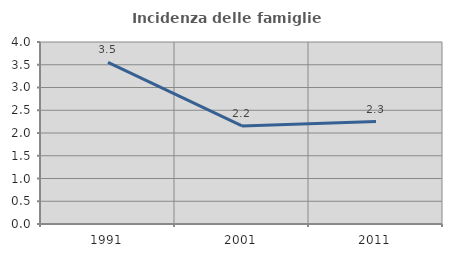
| Category | Incidenza delle famiglie numerose |
|---|---|
| 1991.0 | 3.55 |
| 2001.0 | 2.154 |
| 2011.0 | 2.25 |